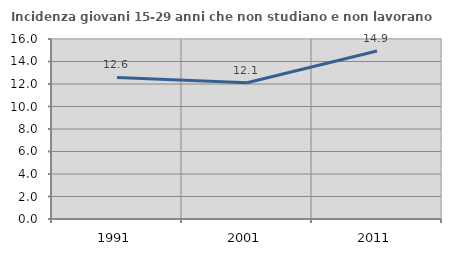
| Category | Incidenza giovani 15-29 anni che non studiano e non lavorano  |
|---|---|
| 1991.0 | 12.579 |
| 2001.0 | 12.106 |
| 2011.0 | 14.928 |